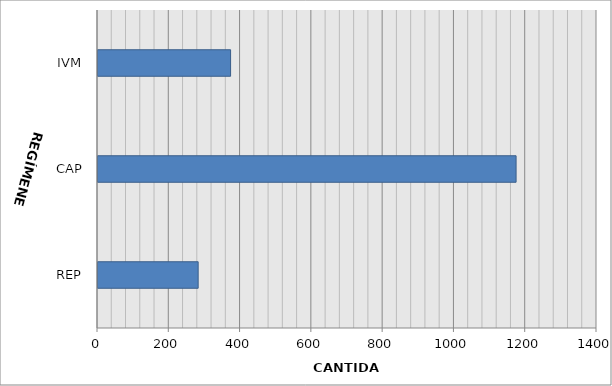
| Category | Series 0 |
|---|---|
| REP | 281 |
| CAP | 1173 |
| IVM | 372 |